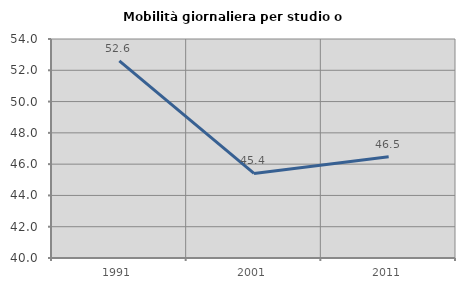
| Category | Mobilità giornaliera per studio o lavoro |
|---|---|
| 1991.0 | 52.598 |
| 2001.0 | 45.405 |
| 2011.0 | 46.468 |